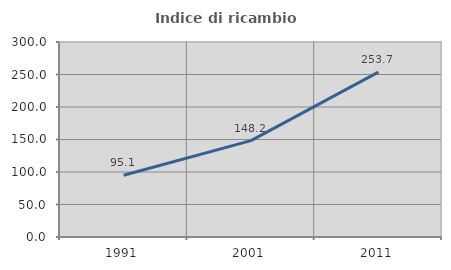
| Category | Indice di ricambio occupazionale  |
|---|---|
| 1991.0 | 95.091 |
| 2001.0 | 148.235 |
| 2011.0 | 253.699 |